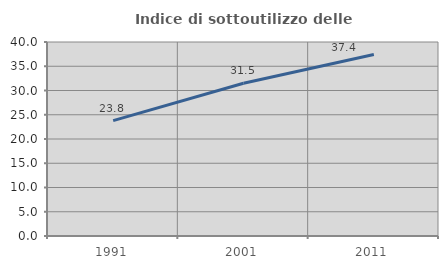
| Category | Indice di sottoutilizzo delle abitazioni  |
|---|---|
| 1991.0 | 23.78 |
| 2001.0 | 31.508 |
| 2011.0 | 37.42 |